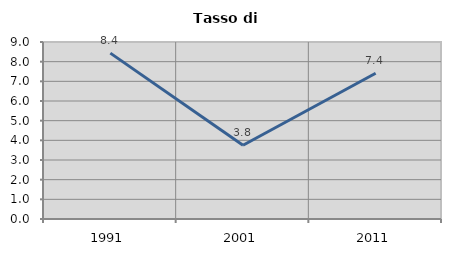
| Category | Tasso di disoccupazione   |
|---|---|
| 1991.0 | 8.434 |
| 2001.0 | 3.751 |
| 2011.0 | 7.412 |